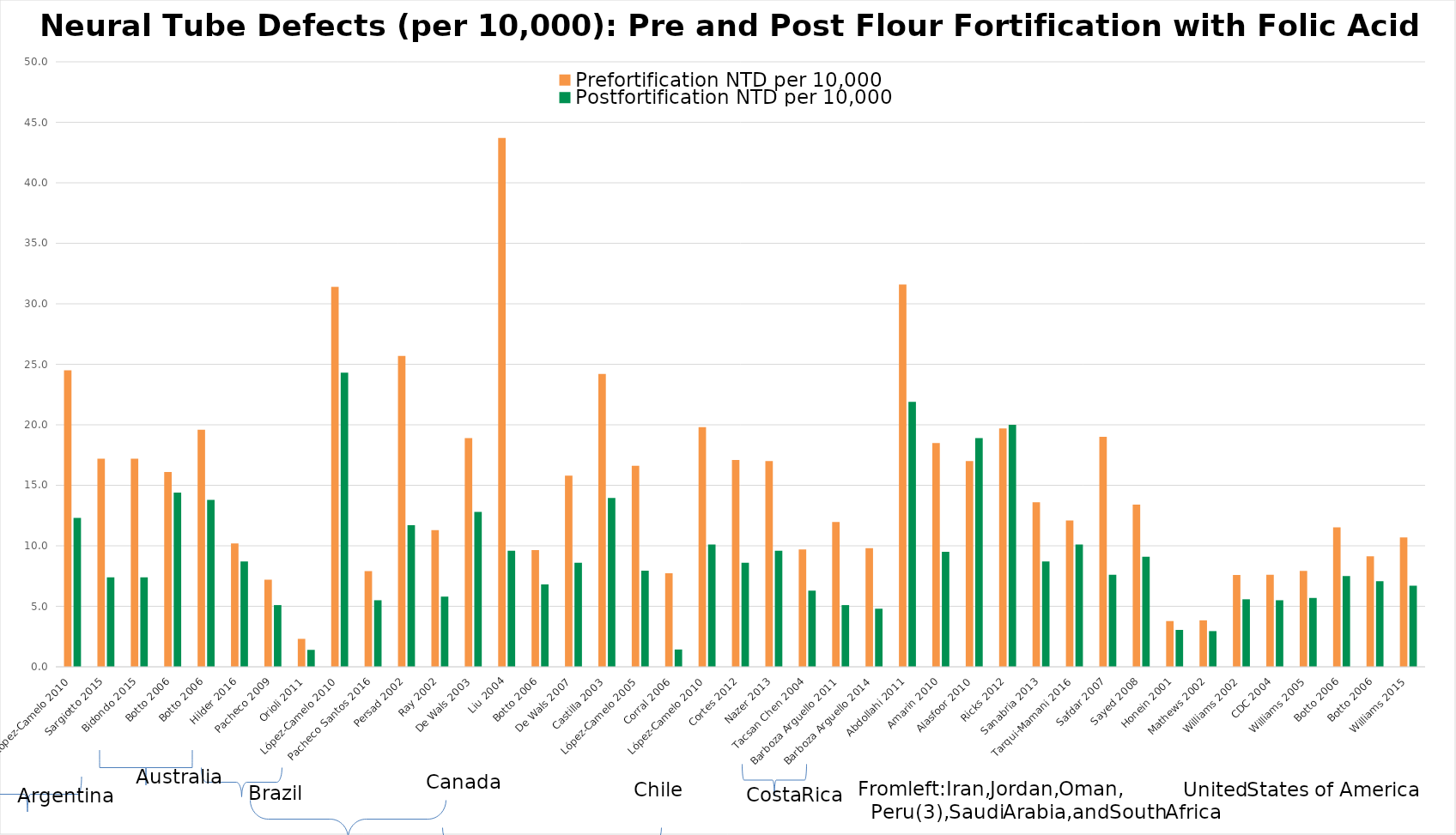
| Category | Prefortification NTD per 10,000 | Postfortification NTD per 10,000 |
|---|---|---|
| López-Camelo 2010 | 24.5 | 12.3 |
| Sargiotto 2015 | 17.2 | 7.4 |
| Bidondo 2015 | 17.2 | 7.4 |
| Botto 2006 | 16.1 | 14.4 |
| Botto 2006 | 19.6 | 13.8 |
| Hilder 2016 | 10.2 | 8.7 |
| Pacheco 2009 | 7.2 | 5.1 |
| Orioli 2011 | 2.31 | 1.4 |
| López-Camelo 2010 | 31.4 | 24.3 |
| Pacheco Santos 2016 | 7.9 | 5.5 |
| Persad 2002 | 25.7 | 11.7 |
| Ray 2002 | 11.3 | 5.8 |
| De Wals 2003 | 18.9 | 12.8 |
| Liu 2004 | 43.7 | 9.6 |
| Botto 2006 | 9.65 | 6.81 |
| De Wals 2007 | 15.8 | 8.6 |
| Castilla 2003 | 24.21 | 13.96 |
| López-Camelo 2005 | 16.61 | 7.95 |
| Corral 2006 | 7.73 | 1.43 |
| López-Camelo 2010 | 19.8 | 10.1 |
| Cortes 2012 | 17.1 | 8.6 |
| Nazer 2013 | 17 | 9.6 |
| Tacsan Chen 2004 | 9.7 | 6.3 |
| Barboza Arguello 2011 | 11.97 | 5.1 |
| Barboza Arguello 2014 | 9.8 | 4.8 |
| Abdollahi 2011 | 31.6 | 21.9 |
| Amarin 2010 | 18.5 | 9.5 |
| Alasfoor 2010 | 17 | 18.9 |
| Ricks 2012 | 19.7 | 20 |
| Sanabria 2013 | 13.6 | 8.7 |
| Tarqui-Mamani 2016 | 12.1 | 10.1 |
| Safdar 2007 | 19 | 7.6 |
| Sayed 2008 | 13.4 | 9.1 |
| Honein 2001 | 3.78 | 3.05 |
| Mathews 2002 | 3.84 | 2.95 |
| Williams 2002 | 7.58 | 5.58 |
| CDC 2004 | 7.6 | 5.5 |
| Williams 2005 | 7.93 | 5.69 |
| Botto 2006 | 11.53 | 7.5 |
| Botto 2006 | 9.13 | 7.07 |
| Williams 2015 | 10.7 | 6.7 |